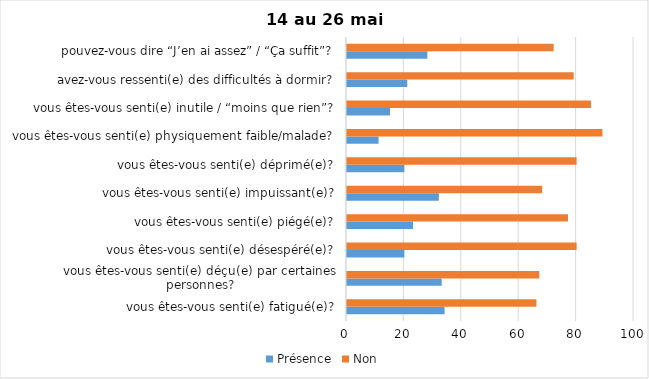
| Category | Présence | Non |
|---|---|---|
| vous êtes-vous senti(e) fatigué(e)? | 34 | 66 |
| vous êtes-vous senti(e) déçu(e) par certaines personnes? | 33 | 67 |
| vous êtes-vous senti(e) désespéré(e)? | 20 | 80 |
| vous êtes-vous senti(e) piégé(e)? | 23 | 77 |
| vous êtes-vous senti(e) impuissant(e)? | 32 | 68 |
| vous êtes-vous senti(e) déprimé(e)? | 20 | 80 |
| vous êtes-vous senti(e) physiquement faible/malade? | 11 | 89 |
| vous êtes-vous senti(e) inutile / “moins que rien”? | 15 | 85 |
| avez-vous ressenti(e) des difficultés à dormir? | 21 | 79 |
| pouvez-vous dire “J’en ai assez” / “Ça suffit”? | 28 | 72 |